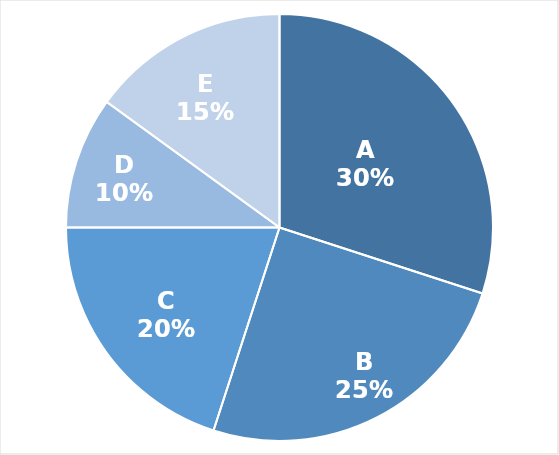
| Category | Tỷ trọng doanh thu |
|---|---|
| A | 0.3 |
| B | 0.25 |
| C | 0.2 |
| D | 0.1 |
| E | 0.15 |